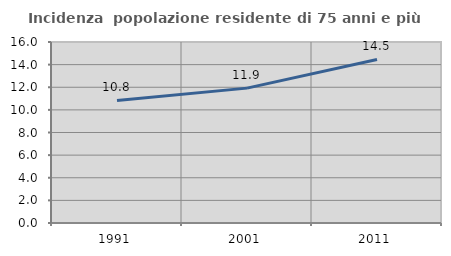
| Category | Incidenza  popolazione residente di 75 anni e più |
|---|---|
| 1991.0 | 10.832 |
| 2001.0 | 11.923 |
| 2011.0 | 14.455 |